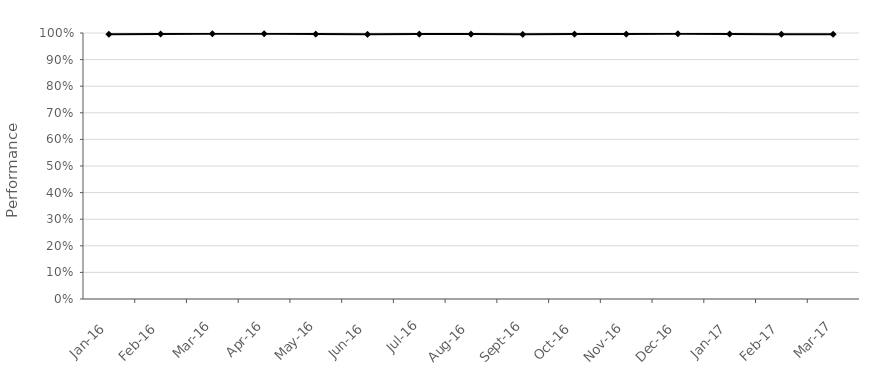
| Category | NPS SL001 |
|---|---|
| 2016-01-01 | 0.995 |
| 2016-02-01 | 0.996 |
| 2016-03-01 | 0.997 |
| 2016-04-01 | 0.997 |
| 2016-05-01 | 0.996 |
| 2016-06-01 | 0.995 |
| 2016-07-01 | 0.996 |
| 2016-08-01 | 0.996 |
| 2016-09-01 | 0.995 |
| 2016-10-01 | 0.996 |
| 2016-11-01 | 0.996 |
| 2016-12-01 | 0.997 |
| 2017-01-01 | 0.996 |
| 2017-02-01 | 0.995 |
| 2017-03-01 | 0.995 |